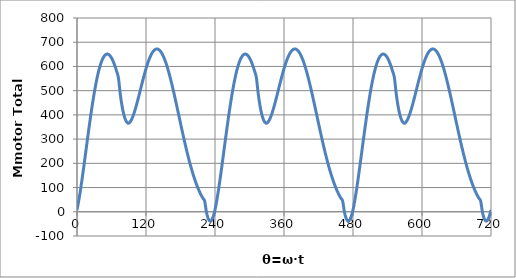
| Category | Mmotor Total |
|---|---|
| 0.0 | 7.574 |
| 3.0 | 45.053 |
| 6.0 | 88.93 |
| 9.0 | 137.531 |
| 12.0 | 189.269 |
| 15.0 | 242.655 |
| 18.0 | 296.316 |
| 21.0 | 349.008 |
| 24.0 | 399.622 |
| 27.0 | 447.194 |
| 30.0 | 490.909 |
| 33.0 | 530.107 |
| 36.0 | 564.268 |
| 39.0 | 593.01 |
| 42.0 | 616.072 |
| 45.0 | 633.321 |
| 48.0 | 644.735 |
| 51.0 | 650.399 |
| 54.0 | 650.498 |
| 57.0 | 645.298 |
| 60.0 | 635.144 |
| 63.0 | 620.44 |
| 66.0 | 601.643 |
| 69.0 | 579.246 |
| 72.0 | 553.768 |
| 75.0 | 490.418 |
| 78.0 | 441.356 |
| 81.0 | 405.518 |
| 84.0 | 381.757 |
| 87.0 | 368.867 |
| 90.0 | 365.6 |
| 93.0 | 372.908 |
| 96.0 | 386.665 |
| 99.0 | 405.643 |
| 102.0 | 428.643 |
| 105.0 | 454.507 |
| 108.0 | 482.133 |
| 111.0 | 510.485 |
| 114.0 | 538.606 |
| 117.0 | 565.625 |
| 120.0 | 590.768 |
| 123.0 | 613.361 |
| 126.0 | 632.835 |
| 129.0 | 648.727 |
| 132.0 | 660.684 |
| 135.0 | 668.456 |
| 138.0 | 671.897 |
| 141.0 | 670.96 |
| 144.0 | 665.687 |
| 147.0 | 656.206 |
| 150.0 | 642.718 |
| 153.0 | 625.49 |
| 156.0 | 604.846 |
| 159.0 | 581.154 |
| 162.0 | 554.814 |
| 165.0 | 526.254 |
| 168.0 | 495.913 |
| 171.0 | 464.24 |
| 174.0 | 431.676 |
| 177.0 | 398.657 |
| 180.0 | 365.6 |
| 183.0 | 332.905 |
| 186.0 | 300.938 |
| 189.0 | 270.019 |
| 192.0 | 240.42 |
| 195.0 | 212.365 |
| 198.0 | 186.03 |
| 201.0 | 161.545 |
| 204.0 | 138.997 |
| 207.0 | 118.432 |
| 210.0 | 99.859 |
| 213.0 | 83.255 |
| 216.0 | 68.566 |
| 219.0 | 55.717 |
| 222.0 | 44.611 |
| 225.0 | -0.189 |
| 228.0 | -27.182 |
| 231.0 | -38.093 |
| 234.0 | -34.716 |
| 237.0 | -18.881 |
| 240.0 | 7.574 |
| 243.0 | 45.053 |
| 246.0 | 88.93 |
| 249.0 | 137.531 |
| 252.0 | 189.269 |
| 255.0 | 242.655 |
| 258.0 | 296.316 |
| 261.0 | 349.008 |
| 264.0 | 399.622 |
| 267.0 | 447.194 |
| 270.0 | 490.909 |
| 273.0 | 530.107 |
| 276.0 | 564.268 |
| 279.0 | 593.01 |
| 282.0 | 616.072 |
| 285.0 | 633.321 |
| 288.0 | 644.735 |
| 291.0 | 650.399 |
| 294.0 | 650.498 |
| 297.0 | 645.298 |
| 300.0 | 635.144 |
| 303.0 | 620.44 |
| 306.0 | 601.643 |
| 309.0 | 579.246 |
| 312.0 | 553.768 |
| 315.0 | 490.418 |
| 318.0 | 441.356 |
| 321.0 | 405.518 |
| 324.0 | 381.757 |
| 327.0 | 368.867 |
| 330.0 | 365.6 |
| 333.0 | 372.908 |
| 336.0 | 386.665 |
| 339.0 | 405.643 |
| 342.0 | 428.643 |
| 345.0 | 454.507 |
| 348.0 | 482.133 |
| 351.0 | 510.485 |
| 354.0 | 538.606 |
| 357.0 | 565.625 |
| 360.0 | 590.768 |
| 363.0 | 613.361 |
| 366.0 | 632.835 |
| 369.0 | 648.727 |
| 372.0 | 660.684 |
| 375.0 | 668.456 |
| 378.0 | 671.897 |
| 381.0 | 670.96 |
| 384.0 | 665.687 |
| 387.0 | 656.206 |
| 390.0 | 642.718 |
| 393.0 | 625.49 |
| 396.0 | 604.846 |
| 399.0 | 581.154 |
| 402.0 | 554.814 |
| 405.0 | 526.254 |
| 408.0 | 495.913 |
| 411.0 | 464.24 |
| 414.0 | 431.676 |
| 417.0 | 398.657 |
| 420.0 | 365.6 |
| 423.0 | 332.905 |
| 426.0 | 300.938 |
| 429.0 | 270.019 |
| 432.0 | 240.42 |
| 435.0 | 212.365 |
| 438.0 | 186.03 |
| 441.0 | 161.545 |
| 444.0 | 138.997 |
| 447.0 | 118.432 |
| 450.0 | 99.859 |
| 453.0 | 83.255 |
| 456.0 | 68.566 |
| 459.0 | 55.717 |
| 462.0 | 44.611 |
| 465.0 | -0.189 |
| 468.0 | -27.182 |
| 471.0 | -38.093 |
| 474.0 | -34.716 |
| 477.0 | -18.881 |
| 480.0 | 7.574 |
| 483.0 | 45.053 |
| 486.0 | 88.93 |
| 489.0 | 137.531 |
| 492.0 | 189.269 |
| 495.0 | 242.655 |
| 498.0 | 296.316 |
| 501.0 | 349.008 |
| 504.0 | 399.622 |
| 507.0 | 447.194 |
| 510.0 | 490.909 |
| 513.0 | 530.107 |
| 516.0 | 564.268 |
| 519.0 | 593.01 |
| 522.0 | 616.072 |
| 525.0 | 633.321 |
| 528.0 | 644.735 |
| 531.0 | 650.399 |
| 534.0 | 650.498 |
| 537.0 | 645.298 |
| 540.0 | 635.144 |
| 543.0 | 620.44 |
| 546.0 | 601.643 |
| 549.0 | 579.246 |
| 552.0 | 553.768 |
| 555.0 | 490.418 |
| 558.0 | 441.356 |
| 561.0 | 405.518 |
| 564.0 | 381.757 |
| 567.0 | 368.867 |
| 570.0 | 365.6 |
| 573.0 | 372.908 |
| 576.0 | 386.665 |
| 579.0 | 405.643 |
| 582.0 | 428.643 |
| 585.0 | 454.507 |
| 588.0 | 482.133 |
| 591.0 | 510.485 |
| 594.0 | 538.606 |
| 597.0 | 565.625 |
| 600.0 | 590.768 |
| 603.0 | 613.361 |
| 606.0 | 632.835 |
| 609.0 | 648.727 |
| 612.0 | 660.684 |
| 615.0 | 668.456 |
| 618.0 | 671.897 |
| 621.0 | 670.96 |
| 624.0 | 665.687 |
| 627.0 | 656.206 |
| 630.0 | 642.718 |
| 633.0 | 625.49 |
| 636.0 | 604.846 |
| 639.0 | 581.154 |
| 642.0 | 554.814 |
| 645.0 | 526.254 |
| 648.0 | 495.913 |
| 651.0 | 464.24 |
| 654.0 | 431.676 |
| 657.0 | 398.657 |
| 660.0 | 365.6 |
| 663.0 | 332.905 |
| 666.0 | 300.938 |
| 669.0 | 270.019 |
| 672.0 | 240.42 |
| 675.0 | 212.365 |
| 678.0 | 186.03 |
| 681.0 | 161.545 |
| 684.0 | 138.997 |
| 687.0 | 118.432 |
| 690.0 | 99.859 |
| 693.0 | 83.255 |
| 696.0 | 68.566 |
| 699.0 | 55.717 |
| 702.0 | 44.611 |
| 705.0 | -0.189 |
| 708.0 | -27.182 |
| 711.0 | -38.093 |
| 714.0 | -34.716 |
| 717.0 | -18.881 |
| 720.0 | 7.574 |